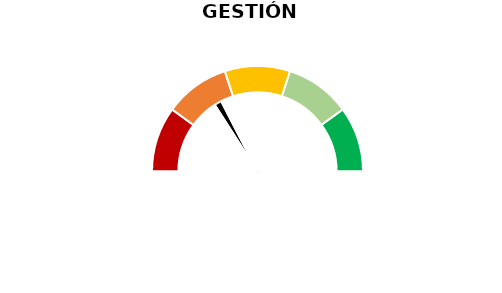
| Category | Puntero |
|---|---|
| 0 | 31.833 |
| 1 | 3 |
| 2 | 165.167 |